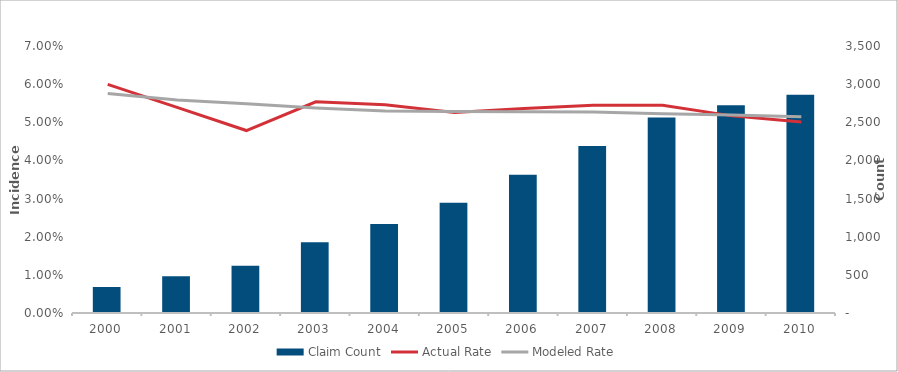
| Category | Claim Count |
|---|---|
| 2000.0 | 341 |
| 2001.0 | 482 |
| 2002.0 | 618 |
| 2003.0 | 926 |
| 2004.0 | 1166 |
| 2005.0 | 1444 |
| 2006.0 | 1813 |
| 2007.0 | 2190 |
| 2008.0 | 2563 |
| 2009.0 | 2724 |
| 2010.0 | 2862 |